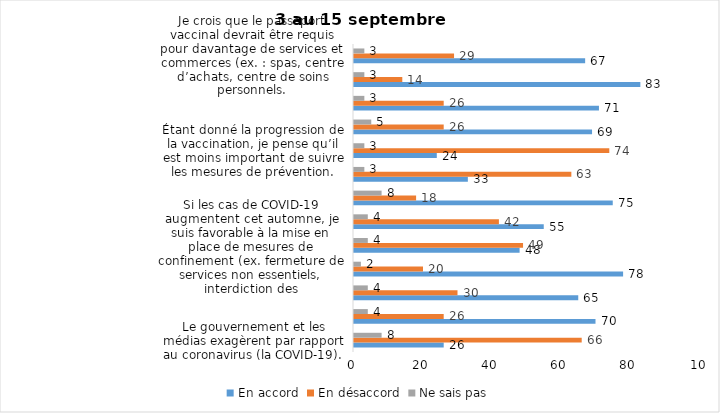
| Category | En accord | En désaccord | Ne sais pas |
|---|---|---|---|
| Le gouvernement et les médias exagèrent par rapport au coronavirus (la COVID-19). | 26 | 66 | 8 |
| J’ai peur que le système de santé soit débordé par les cas de COVID-19 suite au "déconfinement" | 70 | 26 | 4 |
| J’ai peur que la reprise des cours en présentiel dans les cégeps et les universités génère une augmentation des cas de COVID-19. | 65 | 30 | 4 |
| Je suis favorable au passeport vaccinal qui permettrait l'accès à certains lieux ou activités aux personnes vaccinées. | 78 | 20 | 2 |
| Si les cas de COVID-19 augmentent cet automne, je suis favorable à la mise en place de mesures de confinement (ex. fermeture de services non essentiels, interdiction des rassemblements privés) | 48 | 49 | 4 |
| Je suis inquiet de contracter le variant Delta de la Covid-19 | 55 | 42 | 4 |
| Je suis confiant que la vaccination protège efficacement contre les variants de la COVID-19 | 75 | 18 | 8 |
| Je suis favorable à ce que le port du masque ne soit plus obligatoire au Québec. | 33 | 63 | 3 |
| Étant donné la progression de la vaccination, je pense qu’il est moins important de suivre les mesures de prévention. | 24 | 74 | 3 |
| J'ai peur que la reprise des cours en présentiel dans les écoles primaires et secondaires génère une augmentation des cas de COVID-19 | 69 | 26 | 5 |
| Je suis favorable à ce qu’il y ait des sanctions aux commerçants qui ne vérifieront pas le passeport vaccinal (code QR) de leurs clients | 71 | 26 | 3 |
| Je suis favorable à ce qu’il y ait des sanctions aux gens qui tenteront de frauder leur passeport vaccinal par des amendes ou des accusations criminelles. | 83 | 14 | 3 |
| Je crois que le passeport vaccinal devrait être requis pour davantage de services et commerces (ex. : spas, centre d’achats, centre de soins personnels. | 67 | 29 | 3 |